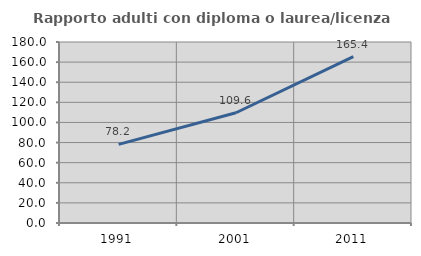
| Category | Rapporto adulti con diploma o laurea/licenza media  |
|---|---|
| 1991.0 | 78.182 |
| 2001.0 | 109.639 |
| 2011.0 | 165.385 |